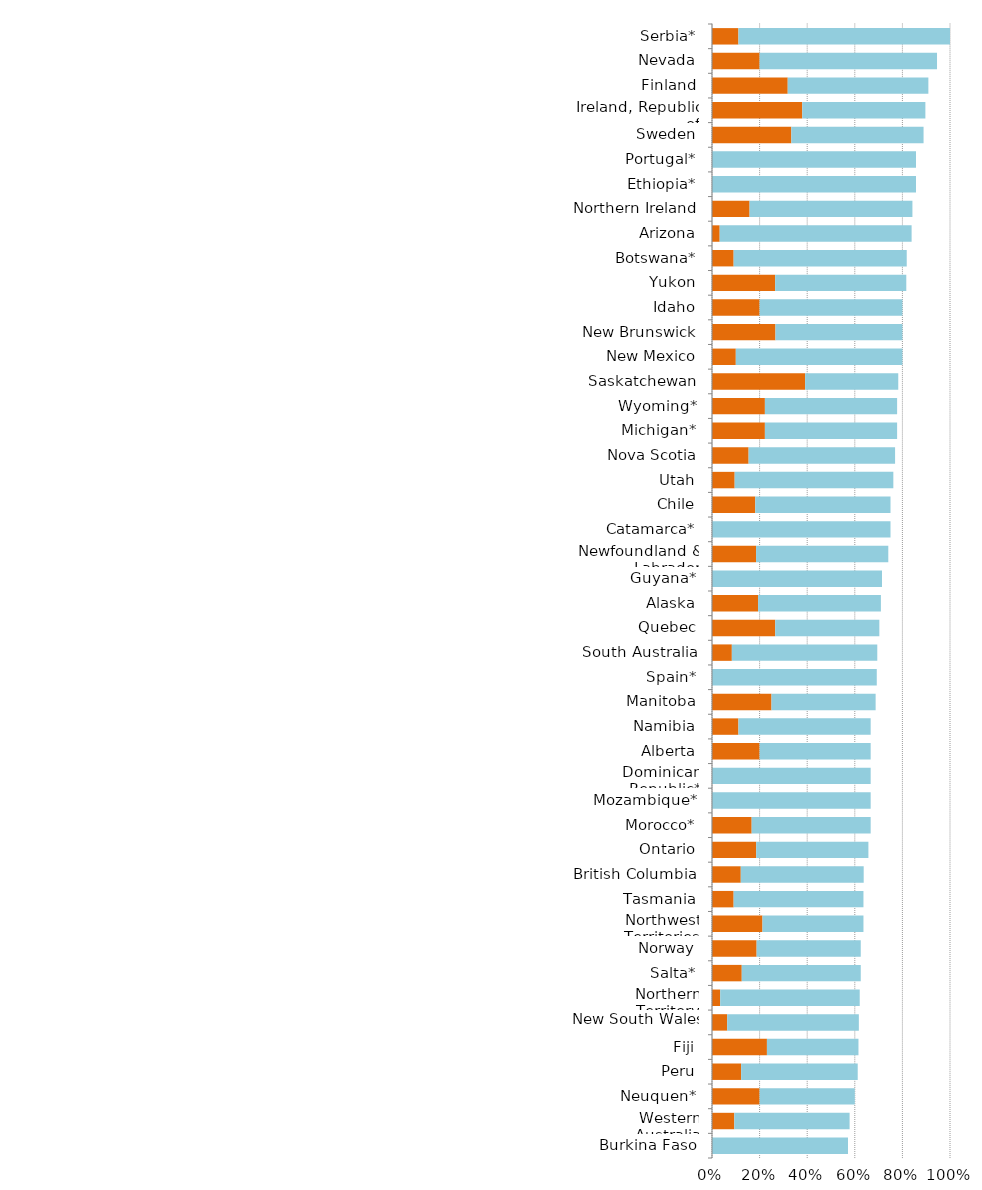
| Category | Series 0 | Series 1 |
|---|---|---|
| Burkina Faso | 0 | 0.571 |
| Western Australia | 0.094 | 0.484 |
| Neuquen* | 0.2 | 0.4 |
| Peru | 0.122 | 0.49 |
| Fiji | 0.231 | 0.385 |
| New South Wales | 0.064 | 0.553 |
| Northern Territory | 0.034 | 0.586 |
| Salta* | 0.125 | 0.5 |
| Norway | 0.188 | 0.438 |
| Northwest Territories | 0.212 | 0.424 |
| Tasmania | 0.091 | 0.545 |
| British Columbia | 0.121 | 0.516 |
| Ontario | 0.186 | 0.471 |
| Morocco* | 0.167 | 0.5 |
| Mozambique* | 0 | 0.667 |
| Dominican Republic* | 0 | 0.667 |
| Alberta | 0.2 | 0.467 |
| Namibia | 0.111 | 0.556 |
| Manitoba | 0.25 | 0.438 |
| Spain* | 0 | 0.692 |
| South Australia | 0.083 | 0.611 |
| Quebec | 0.266 | 0.438 |
| Alaska | 0.194 | 0.516 |
| Guyana* | 0 | 0.714 |
| Newfoundland & Labrador | 0.185 | 0.556 |
| Catamarca* | 0 | 0.75 |
| Chile | 0.182 | 0.568 |
| Utah | 0.095 | 0.667 |
| Nova Scotia | 0.154 | 0.615 |
| Michigan* | 0.222 | 0.556 |
| Wyoming* | 0.222 | 0.556 |
| Saskatchewan | 0.391 | 0.391 |
| New Mexico | 0.1 | 0.7 |
| New Brunswick | 0.267 | 0.533 |
| Idaho | 0.2 | 0.6 |
| Yukon | 0.265 | 0.551 |
| Botswana* | 0.091 | 0.727 |
| Arizona | 0.032 | 0.806 |
| Northern Ireland | 0.158 | 0.684 |
| Ethiopia* | 0 | 0.857 |
| Portugal* | 0 | 0.857 |
| Sweden | 0.333 | 0.556 |
| Ireland, Republic of | 0.379 | 0.517 |
| Finland | 0.318 | 0.591 |
| Nevada | 0.2 | 0.745 |
| Serbia* | 0.111 | 0.889 |